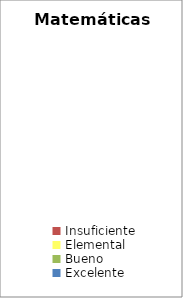
| Category | Matemáticas III |
|---|---|
| Insuficiente | 0 |
| Elemental | 0 |
| Bueno | 0 |
| Excelente | 0 |